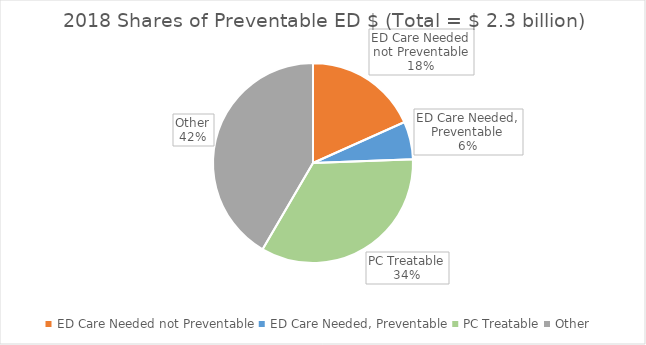
| Category | Series 0 |
|---|---|
| ED Care Needed not Preventable | 426528287.035 |
| ED Care Needed, Preventable | 141905819.903 |
| PC Treatable | 792298135.921 |
| Other | 968709372.521 |